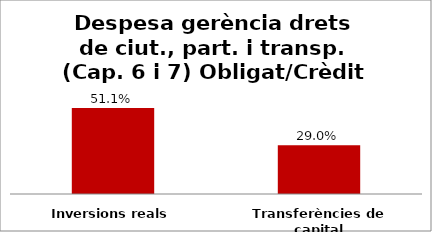
| Category | Series 0 |
|---|---|
| Inversions reals | 0.511 |
| Transferències de capital | 0.29 |